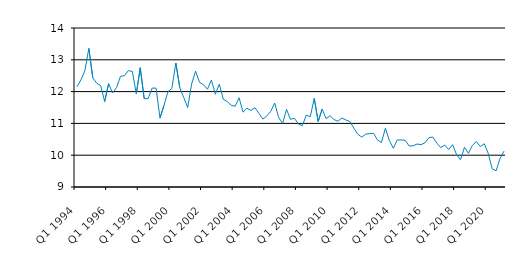
| Category | Series 0 |
|---|---|
| Q1 1994 | 12.15 |
| Q2 1994 | 12.369 |
| Q3 1994 | 12.659 |
| Q4 1994 | 13.357 |
| Q1 1995 | 12.435 |
| Q2 1995 | 12.262 |
| Q3 1995 | 12.188 |
| Q4 1995 | 11.688 |
| Q1 1996 | 12.25 |
| Q2 1996 | 11.958 |
| Q3 1996 | 12.125 |
| Q4 1996 | 12.483 |
| Q1 1997 | 12.5 |
| Q2 1997 | 12.662 |
| Q3 1997 | 12.633 |
| Q4 1997 | 11.933 |
| Q1 1998 | 12.75 |
| Q2 1998 | 11.781 |
| Q3 1998 | 11.781 |
| Q4 1998 | 12.11 |
| Q1 1999 | 12.11 |
| Q2 1999 | 11.166 |
| Q3 1999 | 11.566 |
| Q4 1999 | 12 |
| Q1 2000 | 12.1 |
| Q2 2000 | 12.899 |
| Q3 2000 | 12.125 |
| Q4 2000 | 11.812 |
| Q1 2001 | 11.5 |
| Q2 2001 | 12.241 |
| Q3 2001 | 12.642 |
| Q4 2001 | 12.291 |
| Q1 2002 | 12.215 |
| Q2 2002 | 12.075 |
| Q3 2002 | 12.36 |
| Q4 2002 | 11.917 |
| Q1 2003 | 12.236 |
| Q2 2003 | 11.761 |
| Q3 2003 | 11.688 |
| Q4 2003 | 11.569 |
| Q1 2004 | 11.539 |
| Q2 2004 | 11.807 |
| Q3 2004 | 11.354 |
| Q4 2004 | 11.477 |
| Q1 2005 | 11.406 |
| Q2 2005 | 11.493 |
| Q3 2005 | 11.318 |
| Q4 2005 | 11.136 |
| Q1 2006 | 11.231 |
| Q2 2006 | 11.38 |
| Q3 2006 | 11.64 |
| Q4 2006 | 11.19 |
| Q1 2007 | 11 |
| Q2 2007 | 11.44 |
| Q3 2007 | 11.13 |
| Q4 2007 | 11.16 |
| Q1 2008 | 10.98 |
| Q2 2008 | 10.93 |
| Q3 2008 | 11.26 |
| Q4 2008 | 11.21 |
| Q1 2009 | 11.79 |
| Q2 2009 | 11.06 |
| Q3 2009 | 11.45 |
| Q4 2009 | 11.15 |
| Q1 2010 | 11.24 |
| Q2 2010 | 11.12 |
| Q3 2010 | 11.067 |
| Q4 2010 | 11.166 |
| Q1 2011 | 11.11 |
| Q2 2011 | 11.06 |
| Q3 2011 | 10.855 |
| Q4 2011 | 10.66 |
| Q1 2012 | 10.57 |
| Q2 2012 | 10.66 |
| Q3 2012 | 10.68 |
| Q4 2012 | 10.69 |
| Q1 2013 | 10.48 |
| Q2 2013 | 10.4 |
| Q3 2013 | 10.85 |
| Q4 2013 | 10.46 |
| Q1 2014 | 10.22 |
| Q2 2014 | 10.479 |
| Q3 2014 | 10.48 |
| Q4 2014 | 10.47 |
| Q1 2015 | 10.29 |
| Q2 2015 | 10.295 |
| Q3 2015 | 10.352 |
| Q4 2015 | 10.33 |
| Q1 2016 | 10.39 |
| Q2 2016 | 10.55 |
| Q3 2016 | 10.57 |
| Q4 2016 | 10.38 |
| Q1 2017 | 10.24 |
| Q2 2017 | 10.32 |
| Q3 2017 | 10.18 |
| Q4 2017 | 10.33 |
| Q1 2018 | 10.02 |
| Q2 2018 | 9.86 |
| Q3 2018 | 10.251 |
| Q4 2018 | 10.06 |
| Q1 2019 | 10.308 |
| Q2 2019 | 10.429 |
| Q3 2019 | 10.27 |
| Q4 2019 | 10.36 |
| Q1 2020 | 10.06 |
| Q2 2020 | 9.57 |
| Q3 2020 | 9.51 |
| Q4 2020 | 9.9 |
| Q1 2021 | 10.128 |